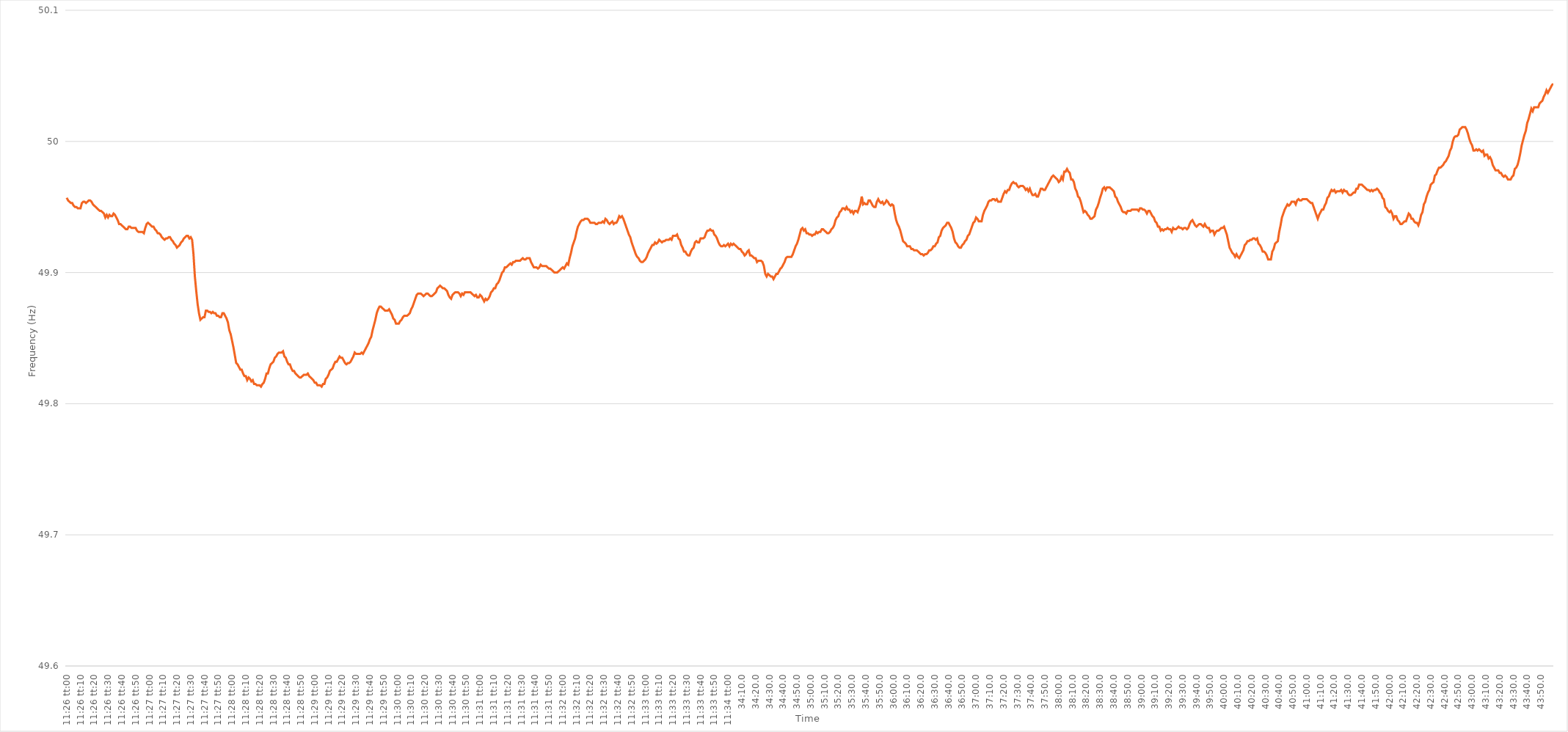
| Category | Series 0 |
|---|---|
| 0.4763888888888889 | 49.957 |
| 0.47640046296296296 | 49.955 |
| 0.47641203703703705 | 49.954 |
| 0.4764236111111111 | 49.953 |
| 0.4764351851851852 | 49.953 |
| 0.4764467592592592 | 49.951 |
| 0.4764583333333334 | 49.95 |
| 0.4764699074074074 | 49.95 |
| 0.4764814814814815 | 49.949 |
| 0.47649305555555554 | 49.949 |
| 0.47650462962962964 | 49.949 |
| 0.4765162037037037 | 49.953 |
| 0.47652777777777783 | 49.954 |
| 0.47653935185185187 | 49.954 |
| 0.47655092592592596 | 49.953 |
| 0.4765625 | 49.954 |
| 0.47657407407407404 | 49.955 |
| 0.47658564814814813 | 49.955 |
| 0.47659722222222217 | 49.954 |
| 0.4766087962962963 | 49.952 |
| 0.47662037037037036 | 49.951 |
| 0.47663194444444446 | 49.95 |
| 0.4766435185185185 | 49.949 |
| 0.4766550925925926 | 49.948 |
| 0.4766666666666666 | 49.947 |
| 0.4766782407407408 | 49.947 |
| 0.4766898148148148 | 49.946 |
| 0.4767013888888889 | 49.945 |
| 0.47671296296296295 | 49.942 |
| 0.47672453703703704 | 49.944 |
| 0.4767361111111111 | 49.942 |
| 0.47674768518518523 | 49.944 |
| 0.47675925925925927 | 49.943 |
| 0.47677083333333337 | 49.943 |
| 0.4767824074074074 | 49.945 |
| 0.4767939814814815 | 49.944 |
| 0.47680555555555554 | 49.942 |
| 0.4768171296296296 | 49.94 |
| 0.4768287037037037 | 49.937 |
| 0.47684027777777777 | 49.937 |
| 0.47685185185185186 | 49.936 |
| 0.4768634259259259 | 49.935 |
| 0.476875 | 49.934 |
| 0.47688657407407403 | 49.933 |
| 0.4768981481481482 | 49.933 |
| 0.4769097222222222 | 49.935 |
| 0.4769212962962963 | 49.935 |
| 0.47693287037037035 | 49.934 |
| 0.47694444444444445 | 49.934 |
| 0.4769560185185185 | 49.934 |
| 0.47696759259259264 | 49.934 |
| 0.4769791666666667 | 49.932 |
| 0.47699074074074077 | 49.931 |
| 0.4770023148148148 | 49.931 |
| 0.4770138888888889 | 49.931 |
| 0.47702546296296294 | 49.931 |
| 0.477037037037037 | 49.93 |
| 0.47704861111111113 | 49.934 |
| 0.47706018518518517 | 49.937 |
| 0.47707175925925926 | 49.938 |
| 0.4770833333333333 | 49.937 |
| 0.4770949074074074 | 49.936 |
| 0.47710648148148144 | 49.935 |
| 0.4771180555555556 | 49.935 |
| 0.4771296296296296 | 49.933 |
| 0.4771412037037037 | 49.932 |
| 0.47715277777777776 | 49.93 |
| 0.47716435185185185 | 49.93 |
| 0.4771759259259259 | 49.929 |
| 0.47718750000000004 | 49.927 |
| 0.4771990740740741 | 49.926 |
| 0.4772106481481482 | 49.925 |
| 0.4772222222222222 | 49.926 |
| 0.4772337962962963 | 49.926 |
| 0.47724537037037035 | 49.927 |
| 0.4772569444444445 | 49.927 |
| 0.47726851851851854 | 49.925 |
| 0.47728009259259263 | 49.924 |
| 0.47729166666666667 | 49.922 |
| 0.4773032407407407 | 49.921 |
| 0.4773148148148148 | 49.919 |
| 0.47732638888888884 | 49.92 |
| 0.477337962962963 | 49.921 |
| 0.47734953703703703 | 49.923 |
| 0.4773611111111111 | 49.924 |
| 0.47737268518518516 | 49.926 |
| 0.47738425925925926 | 49.927 |
| 0.4773958333333333 | 49.928 |
| 0.47740740740740745 | 49.928 |
| 0.4774189814814815 | 49.926 |
| 0.4774305555555556 | 49.927 |
| 0.4774421296296296 | 49.925 |
| 0.4774537037037037 | 49.914 |
| 0.47746527777777775 | 49.897 |
| 0.4774768518518519 | 49.886 |
| 0.47748842592592594 | 49.876 |
| 0.47750000000000004 | 49.869 |
| 0.4775115740740741 | 49.864 |
| 0.4775231481481481 | 49.865 |
| 0.4775347222222222 | 49.866 |
| 0.47754629629629625 | 49.866 |
| 0.4775578703703704 | 49.871 |
| 0.47756944444444444 | 49.871 |
| 0.47758101851851853 | 49.87 |
| 0.47759259259259257 | 49.87 |
| 0.47760416666666666 | 49.869 |
| 0.4776157407407407 | 49.87 |
| 0.47762731481481485 | 49.869 |
| 0.4776388888888889 | 49.869 |
| 0.477650462962963 | 49.867 |
| 0.477662037037037 | 49.867 |
| 0.4776736111111111 | 49.866 |
| 0.47768518518518516 | 49.866 |
| 0.4776967592592593 | 49.869 |
| 0.47770833333333335 | 49.869 |
| 0.47771990740740744 | 49.867 |
| 0.4777314814814815 | 49.865 |
| 0.4777430555555555 | 49.862 |
| 0.4777546296296296 | 49.856 |
| 0.47776620370370365 | 49.853 |
| 0.4777777777777778 | 49.848 |
| 0.47778935185185184 | 49.843 |
| 0.47780092592592593 | 49.837 |
| 0.4778125 | 49.831 |
| 0.47782407407407407 | 49.83 |
| 0.4778356481481481 | 49.828 |
| 0.47784722222222226 | 49.826 |
| 0.4778587962962963 | 49.826 |
| 0.4778703703703704 | 49.823 |
| 0.47788194444444443 | 49.821 |
| 0.4778935185185185 | 49.821 |
| 0.47790509259259256 | 49.818 |
| 0.4779166666666667 | 49.82 |
| 0.47792824074074075 | 49.819 |
| 0.47793981481481485 | 49.817 |
| 0.4779513888888889 | 49.818 |
| 0.477962962962963 | 49.815 |
| 0.477974537037037 | 49.815 |
| 0.47798611111111117 | 49.814 |
| 0.4779976851851852 | 49.814 |
| 0.47800925925925924 | 49.814 |
| 0.47802083333333334 | 49.813 |
| 0.4780324074074074 | 49.815 |
| 0.4780439814814815 | 49.816 |
| 0.4780555555555555 | 49.819 |
| 0.47806712962962966 | 49.823 |
| 0.4780787037037037 | 49.823 |
| 0.4780902777777778 | 49.827 |
| 0.47810185185185183 | 49.83 |
| 0.47811342592592593 | 49.831 |
| 0.47812499999999997 | 49.832 |
| 0.4781365740740741 | 49.835 |
| 0.47814814814814816 | 49.836 |
| 0.47815972222222225 | 49.838 |
| 0.4781712962962963 | 49.839 |
| 0.4781828703703704 | 49.839 |
| 0.4781944444444444 | 49.839 |
| 0.47820601851851857 | 49.84 |
| 0.4782175925925926 | 49.836 |
| 0.47822916666666665 | 49.835 |
| 0.47824074074074074 | 49.832 |
| 0.4782523148148148 | 49.83 |
| 0.4782638888888889 | 49.83 |
| 0.4782754629629629 | 49.827 |
| 0.47828703703703707 | 49.825 |
| 0.4782986111111111 | 49.825 |
| 0.4783101851851852 | 49.823 |
| 0.47832175925925924 | 49.822 |
| 0.47833333333333333 | 49.821 |
| 0.47834490740740737 | 49.82 |
| 0.4783564814814815 | 49.82 |
| 0.47836805555555556 | 49.821 |
| 0.47837962962962965 | 49.822 |
| 0.4783912037037037 | 49.822 |
| 0.4784027777777778 | 49.822 |
| 0.4784143518518518 | 49.823 |
| 0.478425925925926 | 49.821 |
| 0.4784375 | 49.82 |
| 0.47844907407407405 | 49.819 |
| 0.47846064814814815 | 49.818 |
| 0.4784722222222222 | 49.816 |
| 0.4784837962962963 | 49.816 |
| 0.4784953703703703 | 49.814 |
| 0.47850694444444447 | 49.814 |
| 0.4785185185185185 | 49.814 |
| 0.4785300925925926 | 49.813 |
| 0.47854166666666664 | 49.815 |
| 0.47855324074074074 | 49.815 |
| 0.4785648148148148 | 49.819 |
| 0.4785763888888889 | 49.82 |
| 0.47858796296296297 | 49.822 |
| 0.47859953703703706 | 49.825 |
| 0.4786111111111111 | 49.826 |
| 0.4786226851851852 | 49.827 |
| 0.47863425925925923 | 49.83 |
| 0.4786458333333334 | 49.832 |
| 0.4786574074074074 | 49.832 |
| 0.4786689814814815 | 49.834 |
| 0.47868055555555555 | 49.836 |
| 0.47869212962962965 | 49.835 |
| 0.4787037037037037 | 49.835 |
| 0.4787152777777777 | 49.833 |
| 0.4787268518518519 | 49.831 |
| 0.4787384259259259 | 49.83 |
| 0.47875 | 49.831 |
| 0.47876157407407405 | 49.831 |
| 0.47877314814814814 | 49.832 |
| 0.4787847222222222 | 49.834 |
| 0.47879629629629633 | 49.836 |
| 0.47880787037037037 | 49.839 |
| 0.47881944444444446 | 49.838 |
| 0.4788310185185185 | 49.838 |
| 0.4788425925925926 | 49.838 |
| 0.47885416666666664 | 49.838 |
| 0.4788657407407408 | 49.839 |
| 0.4788773148148148 | 49.838 |
| 0.4788888888888889 | 49.84 |
| 0.47890046296296296 | 49.842 |
| 0.47891203703703705 | 49.844 |
| 0.4789236111111111 | 49.846 |
| 0.47893518518518513 | 49.849 |
| 0.4789467592592593 | 49.851 |
| 0.4789583333333333 | 49.856 |
| 0.4789699074074074 | 49.86 |
| 0.47898148148148145 | 49.864 |
| 0.47899305555555555 | 49.869 |
| 0.4790046296296296 | 49.872 |
| 0.47901620370370374 | 49.874 |
| 0.4790277777777778 | 49.874 |
| 0.47903935185185187 | 49.873 |
| 0.4790509259259259 | 49.872 |
| 0.4790625 | 49.871 |
| 0.47907407407407404 | 49.871 |
| 0.4790856481481482 | 49.871 |
| 0.47909722222222223 | 49.872 |
| 0.4791087962962963 | 49.87 |
| 0.47912037037037036 | 49.868 |
| 0.47913194444444446 | 49.865 |
| 0.4791435185185185 | 49.864 |
| 0.47915509259259265 | 49.861 |
| 0.4791666666666667 | 49.861 |
| 0.4791782407407407 | 49.861 |
| 0.4791898148148148 | 49.863 |
| 0.47920138888888886 | 49.864 |
| 0.47921296296296295 | 49.866 |
| 0.479224537037037 | 49.867 |
| 0.47923611111111114 | 49.867 |
| 0.4792476851851852 | 49.867 |
| 0.4792592592592593 | 49.868 |
| 0.4792708333333333 | 49.869 |
| 0.4792824074074074 | 49.872 |
| 0.47929398148148145 | 49.874 |
| 0.4793055555555556 | 49.877 |
| 0.47931712962962963 | 49.88 |
| 0.47932870370370373 | 49.883 |
| 0.47934027777777777 | 49.884 |
| 0.47935185185185186 | 49.884 |
| 0.4793634259259259 | 49.884 |
| 0.47937500000000005 | 49.883 |
| 0.4793865740740741 | 49.882 |
| 0.4793981481481482 | 49.883 |
| 0.4794097222222222 | 49.884 |
| 0.47942129629629626 | 49.884 |
| 0.47943287037037036 | 49.883 |
| 0.4794444444444444 | 49.882 |
| 0.47945601851851855 | 49.882 |
| 0.4794675925925926 | 49.883 |
| 0.4794791666666667 | 49.884 |
| 0.4794907407407407 | 49.885 |
| 0.4795023148148148 | 49.888 |
| 0.47951388888888885 | 49.889 |
| 0.479525462962963 | 49.89 |
| 0.47953703703703704 | 49.889 |
| 0.47954861111111113 | 49.888 |
| 0.4795601851851852 | 49.888 |
| 0.47957175925925927 | 49.887 |
| 0.4795833333333333 | 49.886 |
| 0.47959490740740746 | 49.883 |
| 0.4796064814814815 | 49.881 |
| 0.4796180555555556 | 49.88 |
| 0.47962962962962963 | 49.883 |
| 0.47964120370370367 | 49.884 |
| 0.47965277777777776 | 49.885 |
| 0.4796643518518518 | 49.885 |
| 0.47967592592592595 | 49.885 |
| 0.4796875 | 49.884 |
| 0.4796990740740741 | 49.882 |
| 0.4797106481481481 | 49.884 |
| 0.4797222222222222 | 49.883 |
| 0.47973379629629626 | 49.885 |
| 0.4797453703703704 | 49.885 |
| 0.47975694444444444 | 49.885 |
| 0.47976851851851854 | 49.885 |
| 0.4797800925925926 | 49.885 |
| 0.47979166666666667 | 49.884 |
| 0.4798032407407407 | 49.883 |
| 0.47981481481481486 | 49.882 |
| 0.4798263888888889 | 49.883 |
| 0.479837962962963 | 49.881 |
| 0.47984953703703703 | 49.881 |
| 0.4798611111111111 | 49.883 |
| 0.47987268518518517 | 49.882 |
| 0.4798842592592593 | 49.88 |
| 0.47989583333333335 | 49.878 |
| 0.4799074074074074 | 49.88 |
| 0.4799189814814815 | 49.879 |
| 0.4799305555555555 | 49.88 |
| 0.4799421296296296 | 49.882 |
| 0.47995370370370366 | 49.885 |
| 0.4799652777777778 | 49.886 |
| 0.47997685185185185 | 49.888 |
| 0.47998842592592594 | 49.888 |
| 0.48 | 49.891 |
| 0.4800115740740741 | 49.892 |
| 0.4800231481481481 | 49.894 |
| 0.48003472222222227 | 49.897 |
| 0.4800462962962963 | 49.9 |
| 0.4800578703703704 | 49.901 |
| 0.48006944444444444 | 49.904 |
| 0.48008101851851853 | 49.904 |
| 0.48009259259259257 | 49.905 |
| 0.4801041666666667 | 49.906 |
| 0.48011574074074076 | 49.907 |
| 0.4801273148148148 | 49.906 |
| 0.4801388888888889 | 49.908 |
| 0.48015046296296293 | 49.908 |
| 0.480162037037037 | 49.909 |
| 0.48017361111111106 | 49.909 |
| 0.4801851851851852 | 49.909 |
| 0.48019675925925925 | 49.909 |
| 0.48020833333333335 | 49.91 |
| 0.4802199074074074 | 49.911 |
| 0.4802314814814815 | 49.91 |
| 0.4802430555555555 | 49.91 |
| 0.48025462962962967 | 49.911 |
| 0.4802662037037037 | 49.911 |
| 0.4802777777777778 | 49.911 |
| 0.48028935185185184 | 49.908 |
| 0.48030092592592594 | 49.906 |
| 0.4803125 | 49.904 |
| 0.4803240740740741 | 49.904 |
| 0.48033564814814816 | 49.904 |
| 0.4803472222222222 | 49.903 |
| 0.4803587962962963 | 49.904 |
| 0.48037037037037034 | 49.906 |
| 0.48038194444444443 | 49.905 |
| 0.48039351851851847 | 49.905 |
| 0.4804050925925926 | 49.905 |
| 0.48041666666666666 | 49.905 |
| 0.48042824074074075 | 49.904 |
| 0.4804398148148148 | 49.903 |
| 0.4804513888888889 | 49.903 |
| 0.4804629629629629 | 49.902 |
| 0.4804745370370371 | 49.901 |
| 0.4804861111111111 | 49.9 |
| 0.4804976851851852 | 49.9 |
| 0.48050925925925925 | 49.9 |
| 0.48052083333333334 | 49.901 |
| 0.4805324074074074 | 49.902 |
| 0.48054398148148153 | 49.903 |
| 0.48055555555555557 | 49.904 |
| 0.48056712962962966 | 49.903 |
| 0.4805787037037037 | 49.905 |
| 0.48059027777777774 | 49.907 |
| 0.48060185185185184 | 49.906 |
| 0.4806134259259259 | 49.911 |
| 0.480625 | 49.915 |
| 0.48063657407407406 | 49.92 |
| 0.48064814814814816 | 49.923 |
| 0.4806597222222222 | 49.926 |
| 0.4806712962962963 | 49.931 |
| 0.48068287037037033 | 49.935 |
| 0.4806944444444445 | 49.937 |
| 0.4807060185185185 | 49.939 |
| 0.4807175925925926 | 49.94 |
| 0.48072916666666665 | 49.94 |
| 0.48074074074074075 | 49.941 |
| 0.4807523148148148 | 49.941 |
| 0.48076388888888894 | 49.941 |
| 0.480775462962963 | 49.94 |
| 0.48078703703703707 | 49.938 |
| 0.4807986111111111 | 49.938 |
| 0.4808101851851852 | 49.938 |
| 0.48082175925925924 | 49.938 |
| 0.4808333333333333 | 49.937 |
| 0.48084490740740743 | 49.937 |
| 0.48085648148148147 | 49.938 |
| 0.48086805555555556 | 49.938 |
| 0.4808796296296296 | 49.938 |
| 0.4808912037037037 | 49.939 |
| 0.48090277777777773 | 49.938 |
| 0.4809143518518519 | 49.941 |
| 0.4809259259259259 | 49.94 |
| 0.4809375 | 49.938 |
| 0.48094907407407406 | 49.937 |
| 0.48096064814814815 | 49.938 |
| 0.4809722222222222 | 49.939 |
| 0.48098379629629634 | 49.937 |
| 0.4809953703703704 | 49.938 |
| 0.4810069444444445 | 49.938 |
| 0.4810185185185185 | 49.94 |
| 0.4810300925925926 | 49.943 |
| 0.48104166666666665 | 49.942 |
| 0.4810532407407408 | 49.943 |
| 0.48106481481481483 | 49.941 |
| 0.4810763888888889 | 49.938 |
| 0.48108796296296297 | 49.935 |
| 0.481099537037037 | 49.932 |
| 0.4811111111111111 | 49.929 |
| 0.48112268518518514 | 49.927 |
| 0.4811342592592593 | 49.923 |
| 0.48114583333333333 | 49.92 |
| 0.4811574074074074 | 49.917 |
| 0.48116898148148146 | 49.914 |
| 0.48118055555555556 | 49.912 |
| 0.4811921296296296 | 49.911 |
| 0.48120370370370374 | 49.909 |
| 0.4812152777777778 | 49.908 |
| 0.4812268518518519 | 49.908 |
| 0.4812384259259259 | 49.909 |
| 0.48125 | 49.91 |
| 0.48126157407407405 | 49.912 |
| 0.4812731481481482 | 49.915 |
| 0.48128472222222224 | 49.917 |
| 0.48129629629629633 | 49.919 |
| 0.48130787037037037 | 49.921 |
| 0.4813194444444444 | 49.921 |
| 0.4813310185185185 | 49.923 |
| 0.48134259259259254 | 49.922 |
| 0.4813541666666667 | 49.923 |
| 0.48136574074074073 | 49.925 |
| 0.4813773148148148 | 49.924 |
| 0.48138888888888887 | 49.923 |
| 0.48140046296296296 | 49.924 |
| 0.481412037037037 | 49.924 |
| 0.48142361111111115 | 49.925 |
| 0.4814351851851852 | 49.925 |
| 0.4814467592592593 | 49.925 |
| 0.4814583333333333 | 49.926 |
| 0.4814699074074074 | 49.925 |
| 0.48148148148148145 | 49.928 |
| 0.4814930555555556 | 49.928 |
| 0.48150462962962964 | 49.928 |
| 0.48151620370370374 | 49.929 |
| 0.4815277777777778 | 49.926 |
| 0.4815393518518518 | 49.925 |
| 0.4815509259259259 | 49.921 |
| 0.48156249999999995 | 49.919 |
| 0.4815740740740741 | 49.916 |
| 0.48158564814814814 | 49.916 |
| 0.48159722222222223 | 49.914 |
| 0.48160879629629627 | 49.913 |
| 0.48162037037037037 | 49.913 |
| 0.4816319444444444 | 49.916 |
| 0.48164351851851855 | 49.918 |
| 0.4816550925925926 | 49.919 |
| 0.4816666666666667 | 49.923 |
| 0.4816782407407407 | 49.924 |
| 0.4816898148148148 | 49.923 |
| 0.48170138888888886 | 49.923 |
| 0.481712962962963 | 49.926 |
| 0.48172453703703705 | 49.926 |
| 0.48173611111111114 | 49.926 |
| 0.4817476851851852 | 49.927 |
| 0.4817592592592593 | 49.93 |
| 0.4817708333333333 | 49.932 |
| 0.48178240740740735 | 49.932 |
| 0.4817939814814815 | 49.933 |
| 0.48180555555555554 | 49.932 |
| 0.48181712962962964 | 49.932 |
| 0.4818287037037037 | 49.929 |
| 0.48184027777777777 | 49.928 |
| 0.4818518518518518 | 49.926 |
| 0.48186342592592596 | 49.923 |
| 0.481875 | 49.921 |
| 0.4818865740740741 | 49.92 |
| 0.48189814814814813 | 49.92 |
| 0.4819097222222222 | 49.921 |
| 0.48192129629629626 | 49.92 |
| 0.4819328703703704 | 49.921 |
| 0.48194444444444445 | 49.922 |
| 0.48195601851851855 | 49.92 |
| 0.4819675925925926 | 49.922 |
| 0.4819791666666667 | 49.921 |
| 0.4819907407407407 | 49.922 |
| 0.48200231481481487 | 49.921 |
| 0.4820138888888889 | 49.92 |
| 0.48202546296296295 | 49.919 |
| 0.48203703703703704 | 49.918 |
| 0.4820486111111111 | 49.918 |
| 0.4820601851851852 | 49.916 |
| 0.4820717592592592 | 49.915 |
| 0.48208333333333336 | 49.913 |
| 0.4820949074074074 | 49.914 |
| 0.4821064814814815 | 49.916 |
| 0.48211805555555554 | 49.917 |
| 0.48212962962962963 | 49.913 |
| 0.48214120370370367 | 49.913 |
| 0.4821527777777778 | 49.912 |
| 0.48216435185185186 | 49.911 |
| 0.48217592592592595 | 49.911 |
| 0.4821875 | 49.908 |
| 0.4821990740740741 | 49.909 |
| 0.4822106481481481 | 49.909 |
| 0.4822222222222223 | 49.909 |
| 0.4822337962962963 | 49.908 |
| 0.48224537037037035 | 49.905 |
| 0.48225694444444445 | 49.899 |
| 0.4822685185185185 | 49.897 |
| 0.4822800925925926 | 49.899 |
| 0.4822916666666666 | 49.898 |
| 0.48230324074074077 | 49.897 |
| 0.4823148148148148 | 49.897 |
| 0.4823263888888889 | 49.895 |
| 0.48233796296296294 | 49.897 |
| 0.48234953703703703 | 49.899 |
| 0.4823611111111111 | 49.899 |
| 0.4823726851851852 | 49.901 |
| 0.48238425925925926 | 49.903 |
| 0.48239583333333336 | 49.904 |
| 0.4824074074074074 | 49.906 |
| 0.4824189814814815 | 49.908 |
| 0.48243055555555553 | 49.911 |
| 0.4824421296296297 | 49.912 |
| 0.4824537037037037 | 49.912 |
| 0.4824652777777778 | 49.912 |
| 0.48247685185185185 | 49.912 |
| 0.4824884259259259 | 49.914 |
| 0.4825 | 49.917 |
| 0.482511574074074 | 49.92 |
| 0.4825231481481482 | 49.922 |
| 0.4825347222222222 | 49.925 |
| 0.4825462962962963 | 49.929 |
| 0.48255787037037035 | 49.933 |
| 0.48256944444444444 | 49.934 |
| 0.4825810185185185 | 49.932 |
| 0.48259259259259263 | 49.933 |
| 0.48260416666666667 | 49.93 |
| 0.48261574074074076 | 49.93 |
| 0.4826273148148148 | 49.929 |
| 0.4826388888888889 | 49.929 |
| 0.48265046296296293 | 49.928 |
| 0.4826620370370371 | 49.929 |
| 0.4826736111111111 | 49.929 |
| 0.4826851851851852 | 49.931 |
| 0.48269675925925926 | 49.93 |
| 0.48270833333333335 | 49.931 |
| 0.4827199074074074 | 49.931 |
| 0.48273148148148143 | 49.933 |
| 0.4827430555555556 | 49.933 |
| 0.4827546296296296 | 49.932 |
| 0.4827662037037037 | 49.931 |
| 0.48277777777777775 | 49.93 |
| 0.48278935185185184 | 49.93 |
| 0.4828009259259259 | 49.931 |
| 0.48281250000000003 | 49.933 |
| 0.48282407407407407 | 49.934 |
| 0.48283564814814817 | 49.936 |
| 0.4828472222222222 | 49.94 |
| 0.4828587962962963 | 49.942 |
| 0.48287037037037034 | 49.943 |
| 0.4828819444444445 | 49.946 |
| 0.4828935185185185 | 49.947 |
| 0.4829050925925926 | 49.949 |
| 0.48291666666666666 | 49.949 |
| 0.48292824074074076 | 49.948 |
| 0.4829398148148148 | 49.95 |
| 0.48295138888888894 | 49.948 |
| 0.482962962962963 | 49.948 |
| 0.482974537037037 | 49.946 |
| 0.4829861111111111 | 49.947 |
| 0.48299768518518515 | 49.945 |
| 0.48300925925925925 | 49.947 |
| 0.4830208333333333 | 49.947 |
| 0.48303240740740744 | 49.946 |
| 0.4830439814814815 | 49.949 |
| 0.48305555555555557 | 49.952 |
| 0.4830671296296296 | 49.958 |
| 0.4830787037037037 | 49.952 |
| 0.48309027777777774 | 49.953 |
| 0.4831018518518519 | 49.952 |
| 0.48311342592592593 | 49.952 |
| 0.483125 | 49.955 |
| 0.48313657407407407 | 49.955 |
| 0.48314814814814816 | 49.953 |
| 0.4831597222222222 | 49.951 |
| 0.48317129629629635 | 49.95 |
| 0.4831828703703704 | 49.95 |
| 0.4831944444444444 | 49.954 |
| 0.4832060185185185 | 49.956 |
| 0.48321759259259256 | 49.954 |
| 0.48322916666666665 | 49.953 |
| 0.4832407407407407 | 49.954 |
| 0.48325231481481484 | 49.952 |
| 0.4832638888888889 | 49.953 |
| 0.483275462962963 | 49.955 |
| 0.483287037037037 | 49.954 |
| 0.4832986111111111 | 49.952 |
| 0.48331018518518515 | 49.951 |
| 0.4833217592592593 | 49.952 |
| 0.48333333333333334 | 49.951 |
| 0.48334490740740743 | 49.945 |
| 0.48335648148148147 | 49.94 |
| 0.48336805555555556 | 49.937 |
| 0.4833796296296296 | 49.935 |
| 0.48339120370370375 | 49.932 |
| 0.4834027777777778 | 49.928 |
| 0.4834143518518519 | 49.924 |
| 0.4834259259259259 | 49.923 |
| 0.48343749999999996 | 49.922 |
| 0.48344907407407406 | 49.92 |
| 0.4834606481481481 | 49.92 |
| 0.48347222222222225 | 49.92 |
| 0.4834837962962963 | 49.918 |
| 0.4834953703703704 | 49.918 |
| 0.4835069444444444 | 49.917 |
| 0.4835185185185185 | 49.917 |
| 0.48353009259259255 | 49.917 |
| 0.4835416666666667 | 49.916 |
| 0.48355324074074074 | 49.915 |
| 0.48356481481481484 | 49.914 |
| 0.4835763888888889 | 49.914 |
| 0.48358796296296297 | 49.913 |
| 0.483599537037037 | 49.914 |
| 0.48361111111111116 | 49.914 |
| 0.4836226851851852 | 49.915 |
| 0.4836342592592593 | 49.917 |
| 0.48364583333333333 | 49.917 |
| 0.4836574074074074 | 49.918 |
| 0.48366898148148146 | 49.92 |
| 0.4836805555555555 | 49.92 |
| 0.48369212962962965 | 49.922 |
| 0.4837037037037037 | 49.923 |
| 0.4837152777777778 | 49.927 |
| 0.4837268518518518 | 49.928 |
| 0.4837384259259259 | 49.932 |
| 0.48374999999999996 | 49.934 |
| 0.4837615740740741 | 49.935 |
| 0.48377314814814815 | 49.936 |
| 0.48378472222222224 | 49.938 |
| 0.4837962962962963 | 49.938 |
| 0.4838078703703704 | 49.936 |
| 0.4838194444444444 | 49.934 |
| 0.48383101851851856 | 49.931 |
| 0.4838425925925926 | 49.926 |
| 0.4838541666666667 | 49.923 |
| 0.48386574074074074 | 49.922 |
| 0.48387731481481483 | 49.92 |
| 0.48388888888888887 | 49.919 |
| 0.483900462962963 | 49.919 |
| 0.48391203703703706 | 49.921 |
| 0.4839236111111111 | 49.922 |
| 0.4839351851851852 | 49.924 |
| 0.48394675925925923 | 49.925 |
| 0.4839583333333333 | 49.928 |
| 0.48396990740740736 | 49.929 |
| 0.4839814814814815 | 49.932 |
| 0.48399305555555555 | 49.935 |
| 0.48400462962962965 | 49.938 |
| 0.4840162037037037 | 49.939 |
| 0.4840277777777778 | 49.942 |
| 0.4840393518518518 | 49.941 |
| 0.48405092592592597 | 49.939 |
| 0.4840625 | 49.939 |
| 0.4840740740740741 | 49.939 |
| 0.48408564814814814 | 49.944 |
| 0.48409722222222223 | 49.947 |
| 0.4841087962962963 | 49.949 |
| 0.4841203703703704 | 49.951 |
| 0.48413194444444446 | 49.954 |
| 0.4841435185185185 | 49.955 |
| 0.4841550925925926 | 49.955 |
| 0.48416666666666663 | 49.956 |
| 0.48417824074074073 | 49.956 |
| 0.48418981481481477 | 49.955 |
| 0.4842013888888889 | 49.956 |
| 0.48421296296296296 | 49.954 |
| 0.48422453703703705 | 49.954 |
| 0.4842361111111111 | 49.954 |
| 0.4842476851851852 | 49.957 |
| 0.4842592592592592 | 49.96 |
| 0.4842708333333334 | 49.962 |
| 0.4842824074074074 | 49.961 |
| 0.4842939814814815 | 49.963 |
| 0.48430555555555554 | 49.963 |
| 0.48431712962962964 | 49.966 |
| 0.4843287037037037 | 49.968 |
| 0.48434027777777783 | 49.969 |
| 0.48435185185185187 | 49.968 |
| 0.48436342592592596 | 49.968 |
| 0.484375 | 49.966 |
| 0.48438657407407404 | 49.965 |
| 0.48439814814814813 | 49.966 |
| 0.48440972222222217 | 49.966 |
| 0.4844212962962963 | 49.966 |
| 0.48443287037037036 | 49.965 |
| 0.48444444444444446 | 49.963 |
| 0.4844560185185185 | 49.964 |
| 0.4844675925925926 | 49.962 |
| 0.4844791666666666 | 49.964 |
| 0.4844907407407408 | 49.961 |
| 0.4845023148148148 | 49.959 |
| 0.4845138888888889 | 49.959 |
| 0.48452546296296295 | 49.96 |
| 0.48453703703703704 | 49.958 |
| 0.4845486111111111 | 49.958 |
| 0.48456018518518523 | 49.961 |
| 0.48457175925925927 | 49.964 |
| 0.48458333333333337 | 49.964 |
| 0.4845949074074074 | 49.963 |
| 0.4846064814814815 | 49.963 |
| 0.48461805555555554 | 49.965 |
| 0.4846296296296296 | 49.967 |
| 0.4846412037037037 | 49.969 |
| 0.48465277777777777 | 49.971 |
| 0.48466435185185186 | 49.973 |
| 0.4846759259259259 | 49.974 |
| 0.4846875 | 49.973 |
| 0.48469907407407403 | 49.972 |
| 0.4847106481481482 | 49.971 |
| 0.4847222222222222 | 49.969 |
| 0.4847337962962963 | 49.97 |
| 0.48474537037037035 | 49.973 |
| 0.48475694444444445 | 49.971 |
| 0.4847685185185185 | 49.977 |
| 0.48478009259259264 | 49.977 |
| 0.4847916666666667 | 49.979 |
| 0.48480324074074077 | 49.977 |
| 0.4848148148148148 | 49.976 |
| 0.4848263888888889 | 49.971 |
| 0.48483796296296294 | 49.971 |
| 0.484849537037037 | 49.969 |
| 0.48486111111111113 | 49.964 |
| 0.48487268518518517 | 49.962 |
| 0.48488425925925926 | 49.958 |
| 0.4848958333333333 | 49.957 |
| 0.4849074074074074 | 49.954 |
| 0.48491898148148144 | 49.95 |
| 0.4849305555555556 | 49.946 |
| 0.4849421296296296 | 49.947 |
| 0.4849537037037037 | 49.946 |
| 0.48496527777777776 | 49.944 |
| 0.48497685185185185 | 49.943 |
| 0.4849884259259259 | 49.941 |
| 0.48500000000000004 | 49.941 |
| 0.4850115740740741 | 49.942 |
| 0.4850231481481482 | 49.943 |
| 0.4850347222222222 | 49.948 |
| 0.4850462962962963 | 49.95 |
| 0.48505787037037035 | 49.953 |
| 0.4850694444444445 | 49.957 |
| 0.48508101851851854 | 49.96 |
| 0.4850925925925926 | 49.964 |
| 0.48510416666666667 | 49.965 |
| 0.4851157407407407 | 49.963 |
| 0.4851273148148148 | 49.965 |
| 0.48513888888888884 | 49.965 |
| 0.485150462962963 | 49.965 |
| 0.48516203703703703 | 49.964 |
| 0.4851736111111111 | 49.963 |
| 0.48518518518518516 | 49.962 |
| 0.48519675925925926 | 49.958 |
| 0.4852083333333333 | 49.957 |
| 0.48521990740740745 | 49.954 |
| 0.4852314814814815 | 49.952 |
| 0.4852430555555556 | 49.95 |
| 0.4852546296296296 | 49.947 |
| 0.4852662037037037 | 49.946 |
| 0.48527777777777775 | 49.946 |
| 0.4852893518518519 | 49.945 |
| 0.48530092592592594 | 49.947 |
| 0.48531250000000004 | 49.947 |
| 0.4853240740740741 | 49.947 |
| 0.4853356481481481 | 49.948 |
| 0.4853472222222222 | 49.948 |
| 0.48535879629629625 | 49.948 |
| 0.4853703703703704 | 49.948 |
| 0.48538194444444444 | 49.948 |
| 0.48539351851851853 | 49.947 |
| 0.48540509259259257 | 49.949 |
| 0.48541666666666666 | 49.949 |
| 0.4854282407407407 | 49.948 |
| 0.48543981481481485 | 49.948 |
| 0.4854513888888889 | 49.947 |
| 0.485462962962963 | 49.945 |
| 0.485474537037037 | 49.947 |
| 0.4854861111111111 | 49.947 |
| 0.48549768518518516 | 49.945 |
| 0.4855092592592593 | 49.943 |
| 0.48552083333333335 | 49.942 |
| 0.48553240740740744 | 49.939 |
| 0.4855439814814815 | 49.938 |
| 0.4855555555555556 | 49.935 |
| 0.4855671296296296 | 49.935 |
| 0.48557870370370365 | 49.932 |
| 0.4855902777777778 | 49.933 |
| 0.48560185185185184 | 49.932 |
| 0.48561342592592593 | 49.933 |
| 0.485625 | 49.933 |
| 0.48563657407407407 | 49.934 |
| 0.4856481481481481 | 49.933 |
| 0.48565972222222226 | 49.933 |
| 0.4856712962962963 | 49.931 |
| 0.4856828703703704 | 49.934 |
| 0.48569444444444443 | 49.933 |
| 0.4857060185185185 | 49.933 |
| 0.48571759259259256 | 49.934 |
| 0.4857291666666667 | 49.935 |
| 0.48574074074074075 | 49.934 |
| 0.48575231481481485 | 49.934 |
| 0.4857638888888889 | 49.933 |
| 0.485775462962963 | 49.934 |
| 0.485787037037037 | 49.934 |
| 0.48579861111111106 | 49.933 |
| 0.4858101851851852 | 49.934 |
| 0.48582175925925924 | 49.937 |
| 0.48583333333333334 | 49.939 |
| 0.4858449074074074 | 49.94 |
| 0.4858564814814815 | 49.938 |
| 0.4858680555555555 | 49.936 |
| 0.48587962962962966 | 49.935 |
| 0.4858912037037037 | 49.936 |
| 0.4859027777777778 | 49.937 |
| 0.48591435185185183 | 49.937 |
| 0.48592592592592593 | 49.936 |
| 0.48593749999999997 | 49.935 |
| 0.4859490740740741 | 49.937 |
| 0.48596064814814816 | 49.935 |
| 0.48597222222222225 | 49.934 |
| 0.4859837962962963 | 49.934 |
| 0.4859953703703704 | 49.931 |
| 0.4860069444444444 | 49.932 |
| 0.48601851851851857 | 49.932 |
| 0.4860300925925926 | 49.929 |
| 0.48604166666666665 | 49.931 |
| 0.48605324074074074 | 49.932 |
| 0.4860648148148148 | 49.932 |
| 0.4860763888888889 | 49.933 |
| 0.4860879629629629 | 49.934 |
| 0.48609953703703707 | 49.934 |
| 0.4861111111111111 | 49.935 |
| 0.4861226851851852 | 49.932 |
| 0.48613425925925924 | 49.929 |
| 0.48614583333333333 | 49.924 |
| 0.48615740740740737 | 49.919 |
| 0.4861689814814815 | 49.917 |
| 0.48618055555555556 | 49.915 |
| 0.48619212962962965 | 49.914 |
| 0.4862037037037037 | 49.912 |
| 0.4862152777777778 | 49.914 |
| 0.4862268518518518 | 49.912 |
| 0.486238425925926 | 49.911 |
| 0.48625 | 49.913 |
| 0.4862615740740741 | 49.915 |
| 0.48627314814814815 | 49.917 |
| 0.4862847222222222 | 49.921 |
| 0.4862962962962963 | 49.922 |
| 0.4863078703703703 | 49.924 |
| 0.48631944444444447 | 49.924 |
| 0.4863310185185185 | 49.925 |
| 0.4863425925925926 | 49.925 |
| 0.48635416666666664 | 49.926 |
| 0.48636574074074074 | 49.926 |
| 0.4863773148148148 | 49.925 |
| 0.4863888888888889 | 49.926 |
| 0.48640046296296297 | 49.922 |
| 0.48641203703703706 | 49.921 |
| 0.4864236111111111 | 49.919 |
| 0.4864351851851852 | 49.916 |
| 0.48644675925925923 | 49.916 |
| 0.4864583333333334 | 49.915 |
| 0.4864699074074074 | 49.913 |
| 0.4864814814814815 | 49.91 |
| 0.48649305555555555 | 49.91 |
| 0.48650462962962965 | 49.91 |
| 0.4865162037037037 | 49.916 |
| 0.4865277777777777 | 49.918 |
| 0.4865393518518519 | 49.922 |
| 0.4865509259259259 | 49.923 |
| 0.4865625 | 49.924 |
| 0.48657407407407405 | 49.931 |
| 0.48658564814814814 | 49.936 |
| 0.4865972222222222 | 49.942 |
| 0.48660879629629633 | 49.945 |
| 0.48662037037037037 | 49.948 |
| 0.48663194444444446 | 49.95 |
| 0.4866435185185185 | 49.952 |
| 0.4866550925925926 | 49.951 |
| 0.48666666666666664 | 49.952 |
| 0.4866782407407408 | 49.954 |
| 0.4866898148148148 | 49.954 |
| 0.4867013888888889 | 49.954 |
| 0.48671296296296296 | 49.952 |
| 0.48672453703703705 | 49.955 |
| 0.4867361111111111 | 49.956 |
| 0.48674768518518513 | 49.955 |
| 0.4867592592592593 | 49.955 |
| 0.4867708333333333 | 49.956 |
| 0.4867824074074074 | 49.956 |
| 0.48679398148148145 | 49.956 |
| 0.48680555555555555 | 49.956 |
| 0.4868171296296296 | 49.955 |
| 0.48682870370370374 | 49.954 |
| 0.4868402777777778 | 49.953 |
| 0.48685185185185187 | 49.953 |
| 0.4868634259259259 | 49.95 |
| 0.486875 | 49.947 |
| 0.48688657407407404 | 49.944 |
| 0.4868981481481482 | 49.941 |
| 0.48690972222222223 | 49.944 |
| 0.4869212962962963 | 49.946 |
| 0.48693287037037036 | 49.948 |
| 0.48694444444444446 | 49.948 |
| 0.4869560185185185 | 49.951 |
| 0.48696759259259265 | 49.953 |
| 0.4869791666666667 | 49.957 |
| 0.4869907407407407 | 49.958 |
| 0.4870023148148148 | 49.961 |
| 0.48701388888888886 | 49.963 |
| 0.48702546296296295 | 49.962 |
| 0.487037037037037 | 49.963 |
| 0.48704861111111114 | 49.961 |
| 0.4870601851851852 | 49.962 |
| 0.4870717592592593 | 49.962 |
| 0.4870833333333333 | 49.962 |
| 0.4870949074074074 | 49.963 |
| 0.48710648148148145 | 49.961 |
| 0.4871180555555556 | 49.963 |
| 0.48712962962962963 | 49.962 |
| 0.48714120370370373 | 49.962 |
| 0.48715277777777777 | 49.96 |
| 0.48716435185185186 | 49.959 |
| 0.4871759259259259 | 49.959 |
| 0.48718750000000005 | 49.96 |
| 0.4871990740740741 | 49.961 |
| 0.4872106481481482 | 49.961 |
| 0.4872222222222222 | 49.964 |
| 0.48723379629629626 | 49.964 |
| 0.48724537037037036 | 49.967 |
| 0.4872569444444444 | 49.967 |
| 0.48726851851851855 | 49.967 |
| 0.4872800925925926 | 49.966 |
| 0.4872916666666667 | 49.965 |
| 0.4873032407407407 | 49.964 |
| 0.4873148148148148 | 49.963 |
| 0.48732638888888885 | 49.963 |
| 0.487337962962963 | 49.962 |
| 0.48734953703703704 | 49.963 |
| 0.48736111111111113 | 49.962 |
| 0.4873726851851852 | 49.963 |
| 0.48738425925925927 | 49.963 |
| 0.4873958333333333 | 49.964 |
| 0.48740740740740746 | 49.963 |
| 0.4874189814814815 | 49.961 |
| 0.4874305555555556 | 49.96 |
| 0.48744212962962963 | 49.957 |
| 0.48745370370370367 | 49.956 |
| 0.48746527777777776 | 49.95 |
| 0.4874768518518518 | 49.949 |
| 0.48748842592592595 | 49.947 |
| 0.4875 | 49.946 |
| 0.4875115740740741 | 49.947 |
| 0.4875231481481481 | 49.945 |
| 0.4875347222222222 | 49.941 |
| 0.48754629629629626 | 49.943 |
| 0.4875578703703704 | 49.943 |
| 0.48756944444444444 | 49.94 |
| 0.48758101851851854 | 49.939 |
| 0.4875925925925926 | 49.937 |
| 0.48760416666666667 | 49.937 |
| 0.4876157407407407 | 49.938 |
| 0.48762731481481486 | 49.939 |
| 0.4876388888888889 | 49.939 |
| 0.487650462962963 | 49.942 |
| 0.48766203703703703 | 49.945 |
| 0.4876736111111111 | 49.944 |
| 0.48768518518518517 | 49.941 |
| 0.4876967592592592 | 49.941 |
| 0.48770833333333335 | 49.939 |
| 0.4877199074074074 | 49.938 |
| 0.4877314814814815 | 49.938 |
| 0.4877430555555555 | 49.936 |
| 0.4877546296296296 | 49.939 |
| 0.48776620370370366 | 49.944 |
| 0.4877777777777778 | 49.946 |
| 0.48778935185185185 | 49.952 |
| 0.48780092592592594 | 49.954 |
| 0.4878125 | 49.958 |
| 0.4878240740740741 | 49.961 |
| 0.4878356481481481 | 49.963 |
| 0.48784722222222227 | 49.967 |
| 0.4878587962962963 | 49.968 |
| 0.4878703703703704 | 49.969 |
| 0.48788194444444444 | 49.974 |
| 0.48789351851851853 | 49.975 |
| 0.48790509259259257 | 49.978 |
| 0.4879166666666667 | 49.98 |
| 0.48792824074074076 | 49.98 |
| 0.4879398148148148 | 49.981 |
| 0.4879513888888889 | 49.982 |
| 0.48796296296296293 | 49.984 |
| 0.487974537037037 | 49.985 |
| 0.48798611111111106 | 49.987 |
| 0.4879976851851852 | 49.989 |
| 0.48800925925925925 | 49.993 |
| 0.48802083333333335 | 49.995 |
| 0.4880324074074074 | 50 |
| 0.4880439814814815 | 50.003 |
| 0.4880555555555555 | 50.004 |
| 0.48806712962962967 | 50.004 |
| 0.4880787037037037 | 50.005 |
| 0.4880902777777778 | 50.009 |
| 0.48810185185185184 | 50.01 |
| 0.48811342592592594 | 50.011 |
| 0.488125 | 50.011 |
| 0.4881365740740741 | 50.011 |
| 0.48814814814814816 | 50.009 |
| 0.48815972222222226 | 50.006 |
| 0.4881712962962963 | 50.002 |
| 0.48818287037037034 | 49.999 |
| 0.48819444444444443 | 49.997 |
| 0.48820601851851847 | 49.993 |
| 0.4882175925925926 | 49.993 |
| 0.48822916666666666 | 49.994 |
| 0.48824074074074075 | 49.993 |
| 0.4882523148148148 | 49.994 |
| 0.4882638888888889 | 49.993 |
| 0.4882754629629629 | 49.992 |
| 0.4882870370370371 | 49.993 |
| 0.4882986111111111 | 49.989 |
| 0.4883101851851852 | 49.99 |
| 0.48832175925925925 | 49.99 |
| 0.48833333333333334 | 49.987 |
| 0.4883449074074074 | 49.988 |
| 0.48835648148148153 | 49.986 |
| 0.48836805555555557 | 49.982 |
| 0.48837962962962966 | 49.98 |
| 0.4883912037037037 | 49.978 |
| 0.48840277777777774 | 49.978 |
| 0.48841435185185184 | 49.978 |
| 0.4884259259259259 | 49.976 |
| 0.4884375 | 49.976 |
| 0.48844907407407406 | 49.974 |
| 0.48846064814814816 | 49.973 |
| 0.4884722222222222 | 49.974 |
| 0.4884837962962963 | 49.973 |
| 0.48849537037037033 | 49.971 |
| 0.4885069444444445 | 49.971 |
| 0.4885185185185185 | 49.971 |
| 0.4885300925925926 | 49.973 |
| 0.48854166666666665 | 49.974 |
| 0.48855324074074075 | 49.979 |
| 0.4885648148148148 | 49.98 |
| 0.48857638888888894 | 49.982 |
| 0.488587962962963 | 49.986 |
| 0.48859953703703707 | 49.991 |
| 0.4886111111111111 | 49.997 |
| 0.4886226851851852 | 50.001 |
| 0.48863425925925924 | 50.005 |
| 0.4886458333333333 | 50.008 |
| 0.48865740740740743 | 50.014 |
| 0.48866898148148147 | 50.017 |
| 0.48868055555555556 | 50.021 |
| 0.4886921296296296 | 50.025 |
| 0.4887037037037037 | 50.023 |
| 0.48871527777777773 | 50.026 |
| 0.4887268518518519 | 50.026 |
| 0.4887384259259259 | 50.026 |
| 0.48875 | 50.026 |
| 0.48876157407407406 | 50.029 |
| 0.48877314814814815 | 50.03 |
| 0.4887847222222222 | 50.031 |
| 0.48879629629629634 | 50.034 |
| 0.4888078703703704 | 50.036 |
| 0.4888194444444445 | 50.039 |
| 0.4888310185185185 | 50.037 |
| 0.4888425925925926 | 50.039 |
| 0.48885416666666665 | 50.041 |
| 0.4888657407407408 | 50.043 |
| 0.48887731481481483 | 50.044 |